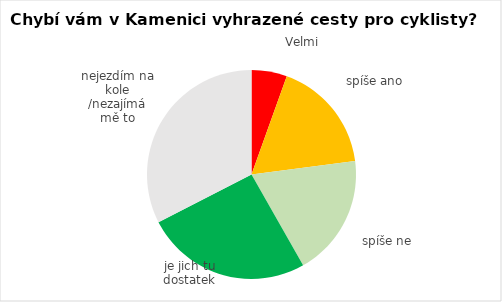
| Category | Series 0 |
|---|---|
| Velmi | 16 |
| spíše ano | 51 |
| spíše ne | 55 |
| je jich tu dostatek | 75 |
| nejezdím na kole /nezajímá mě to | 95 |